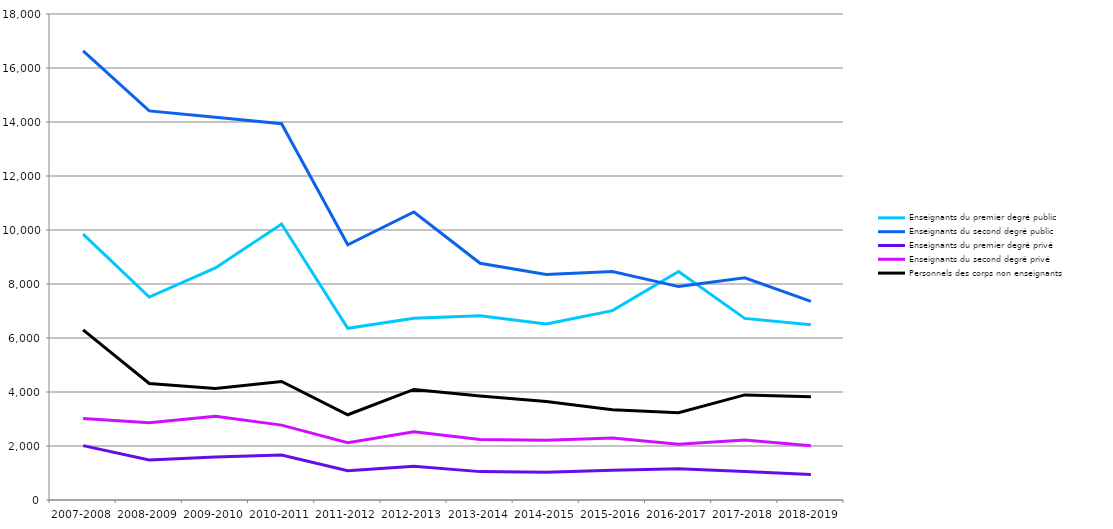
| Category | Enseignants du premier degré public | Enseignants du second degré public | Enseignants du premier degré privé | Enseignants du second degré privé | Personnels des corps non enseignants  |
|---|---|---|---|---|---|
| 2007-2008 | 9849 | 16632 | 2013 | 3020 | 6304 |
| 2008-2009 | 7516 | 14412 | 1483 | 2857 | 4315 |
| 2009-2010 | 8594 | 14175 | 1596 | 3102 | 4134 |
| 2010-2011 | 10223 | 13935 | 1663 | 2774 | 4392 |
| 2011-2012 | 6361 | 9452 | 1081 | 2121 | 3157 |
| 2012-2013 | 6733 | 10666 | 1252 | 2527 | 4096 |
| 2013-2014 | 6822 | 8767 | 1051 | 2244 | 3856 |
| 2014-2015 | 6520 | 8352 | 1025 | 2209 | 3648 |
| 2015-2016 | 7014 | 8459 | 1105 | 2295 | 3345 |
| 2016-2017 | 8466 | 7904 | 1160 | 2067 | 3232 |
| 2017-2018 | 6727 | 8231 | 1056 | 2225 | 3892 |
| 2018-2019 | 6492 | 7355 | 947 | 2009 | 3827 |